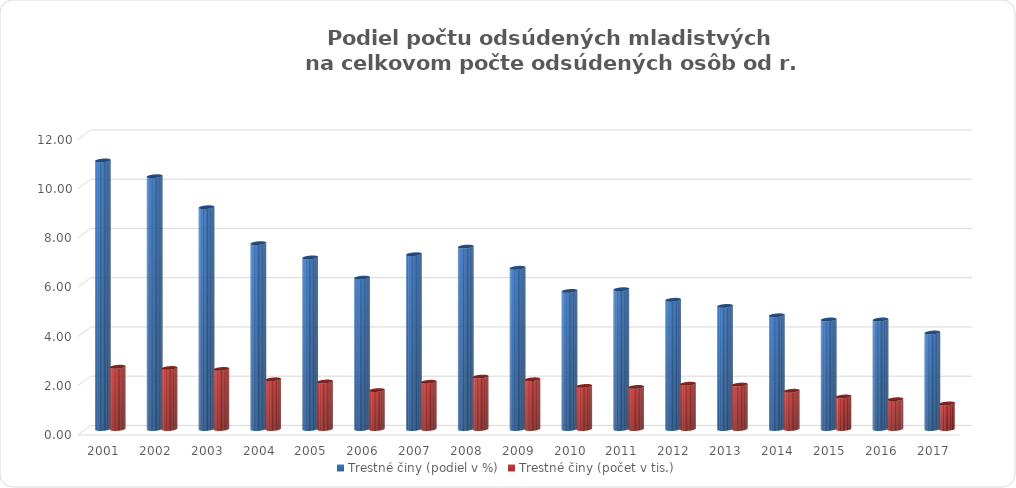
| Category | Trestné činy (podiel v %) | Trestné činy (počet v tis.) |
|---|---|---|
| 2001.0 | 10.91 | 2.53 |
| 2002.0 | 10.27 | 2.48 |
| 2003.0 | 9.01 | 2.44 |
| 2004.0 | 7.55 | 2.02 |
| 2005.0 | 6.97 | 1.93 |
| 2006.0 | 6.15 | 1.58 |
| 2007.0 | 7.1 | 1.92 |
| 2008.0 | 7.41 | 2.13 |
| 2009.0 | 6.55 | 2.02 |
| 2010.0 | 5.61 | 1.75 |
| 2011.0 | 5.68 | 1.71 |
| 2012.0 | 5.25 | 1.84 |
| 2013.0 | 5 | 1.806 |
| 2014.0 | 4.62 | 1.554 |
| 2015.0 | 4.45 | 1.32 |
| 2016.0 | 4.45 | 1.21 |
| 2017.0 | 3.92 | 1.04 |